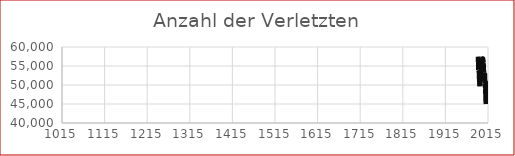
| Category | Verletzte |
|---|---|
| 1992.0 | 57473 |
| 1993.0 | 53987 |
| 1994.0 | 53818 |
| 1995.0 | 50764 |
| 1996.0 | 49673 |
| 1997.0 | 51591 |
| 1998.0 | 51077 |
| 1999.0 | 54967 |
| 2000.0 | 54929 |
| 2001.0 | 56265 |
| 2002.0 | 56684 |
| 2003.0 | 56881 |
| 2004.0 | 55857 |
| 2005.0 | 53234 |
| 2006.0 | 51930 |
| 2007.0 | 53211 |
| 2008.0 | 50521 |
| 2009.0 | 49158 |
| 2010.0 | 45858 |
| 2011.0 | 45025 |
| 2012.0 | 50895 |
| 2013.0 | 48044 |
| 2014.0 | 47670 |